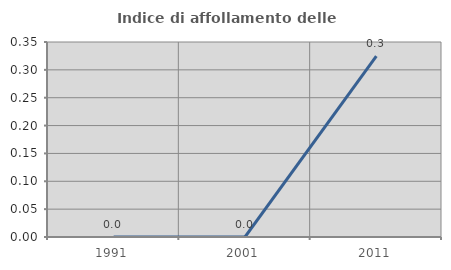
| Category | Indice di affollamento delle abitazioni  |
|---|---|
| 1991.0 | 0 |
| 2001.0 | 0 |
| 2011.0 | 0.325 |